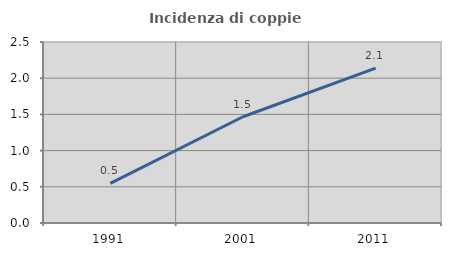
| Category | Incidenza di coppie miste |
|---|---|
| 1991.0 | 0.548 |
| 2001.0 | 1.468 |
| 2011.0 | 2.139 |